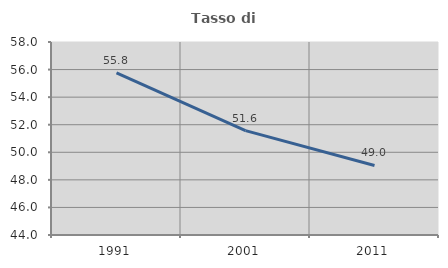
| Category | Tasso di occupazione   |
|---|---|
| 1991.0 | 55.761 |
| 2001.0 | 51.569 |
| 2011.0 | 49.042 |